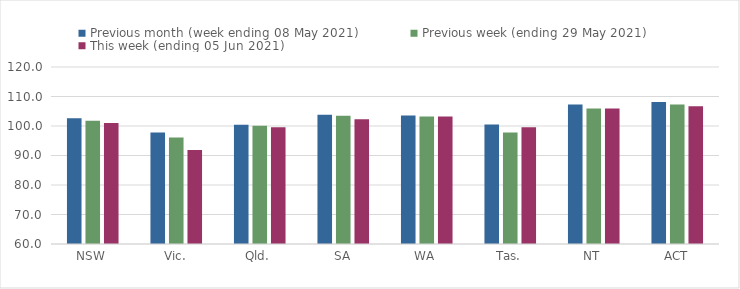
| Category | Previous month (week ending 08 May 2021) | Previous week (ending 29 May 2021) | This week (ending 05 Jun 2021) |
|---|---|---|---|
| NSW | 102.63 | 101.81 | 101.05 |
| Vic. | 97.76 | 96.11 | 91.85 |
| Qld. | 100.39 | 100.09 | 99.55 |
| SA | 103.81 | 103.48 | 102.33 |
| WA | 103.53 | 103.21 | 103.21 |
| Tas. | 100.5 | 97.8 | 99.54 |
| NT | 107.26 | 105.9 | 105.9 |
| ACT | 108.12 | 107.29 | 106.73 |